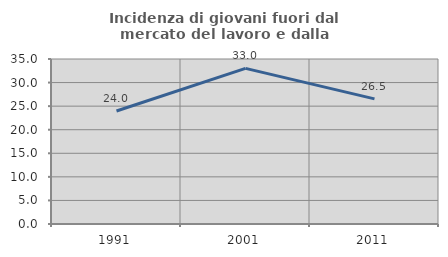
| Category | Incidenza di giovani fuori dal mercato del lavoro e dalla formazione  |
|---|---|
| 1991.0 | 23.966 |
| 2001.0 | 33.009 |
| 2011.0 | 26.536 |